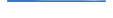
| Category | Series 0 |
|---|---|
| 0 | 1110.431 |
| 1 | 996.969 |
| 2 | 915.647 |
| 3 | 747.672 |
| 4 | 737.512 |
| 5 | 718 |
| 6 | 677 |
| 7 | 609 |
| 8 | 664 |